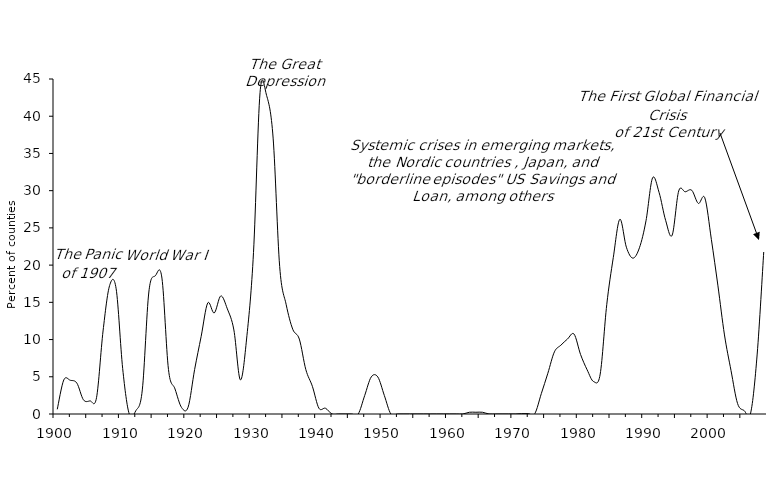
| Category | Series 1 |
|---|---|
| 1900.0 | 0.63 |
| 1901.0 | 4.583 |
| 1902.0 | 4.527 |
| 1903.0 | 4.143 |
| 1904.0 | 1.907 |
| 1905.0 | 1.763 |
| 1906.0 | 2.19 |
| 1907.0 | 11.153 |
| 1908.0 | 17.253 |
| 1909.0 | 16.827 |
| 1910.0 | 6.1 |
| 1911.0 | 0 |
| 1912.0 | 0.427 |
| 1913.0 | 3.233 |
| 1914.0 | 16.387 |
| 1915.0 | 18.577 |
| 1916.0 | 18.26 |
| 1917.0 | 5.98 |
| 1918.0 | 3.363 |
| 1919.0 | 0.873 |
| 1920.0 | 0.913 |
| 1921.0 | 5.987 |
| 1922.0 | 10.433 |
| 1923.0 | 14.91 |
| 1924.0 | 13.573 |
| 1925.0 | 15.863 |
| 1926.0 | 14.12 |
| 1927.0 | 11.287 |
| 1928.0 | 4.58 |
| 1929.0 | 10.57 |
| 1930.0 | 21.71 |
| 1931.0 | 43.18 |
| 1932.0 | 42.79 |
| 1933.0 | 37.057 |
| 1934.0 | 19.813 |
| 1935.0 | 14.673 |
| 1936.0 | 11.38 |
| 1937.0 | 10.067 |
| 1938.0 | 5.96 |
| 1939.0 | 3.717 |
| 1940.0 | 0.773 |
| 1941.0 | 0.773 |
| 1942.0 | 0 |
| 1943.0 | 0 |
| 1944.0 | 0 |
| 1945.0 | 0 |
| 1946.0 | 0 |
| 1947.0 | 2.49 |
| 1948.0 | 4.98 |
| 1949.0 | 4.98 |
| 1950.0 | 2.49 |
| 1951.0 | 0 |
| 1952.0 | 0 |
| 1953.0 | 0 |
| 1954.0 | 0 |
| 1955.0 | 0 |
| 1956.0 | 0 |
| 1957.0 | 0 |
| 1958.0 | 0 |
| 1959.0 | 0 |
| 1960.0 | 0 |
| 1961.0 | 0 |
| 1962.0 | 0 |
| 1963.0 | 0.233 |
| 1964.0 | 0.233 |
| 1965.0 | 0.233 |
| 1966.0 | 0 |
| 1967.0 | 0 |
| 1968.0 | 0 |
| 1969.0 | 0 |
| 1970.0 | 0 |
| 1971.0 | 0.047 |
| 1972.0 | 0.047 |
| 1973.0 | 0.047 |
| 1974.0 | 2.74 |
| 1975.0 | 5.48 |
| 1976.0 | 8.347 |
| 1977.0 | 9.253 |
| 1978.0 | 10.073 |
| 1979.0 | 10.737 |
| 1980.0 | 7.99 |
| 1981.0 | 5.94 |
| 1982.0 | 4.353 |
| 1983.0 | 5.363 |
| 1984.0 | 14.68 |
| 1985.0 | 21.003 |
| 1986.0 | 26.157 |
| 1987.0 | 22.407 |
| 1988.0 | 20.937 |
| 1989.0 | 22.33 |
| 1990.0 | 25.947 |
| 1991.0 | 31.707 |
| 1992.0 | 29.767 |
| 1993.0 | 26.02 |
| 1994.0 | 24.017 |
| 1995.0 | 29.96 |
| 1996.0 | 29.85 |
| 1997.0 | 30.05 |
| 1998.0 | 28.287 |
| 1999.0 | 29.02 |
| 2000.0 | 23.42 |
| 2001.0 | 17.213 |
| 2002.0 | 10.617 |
| 2003.0 | 5.837 |
| 2004.0 | 1.407 |
| 2005.0 | 0.467 |
| 2006.0 | 0.14 |
| 2007.0 | 8.05 |
| 2008.0 | 21.76 |